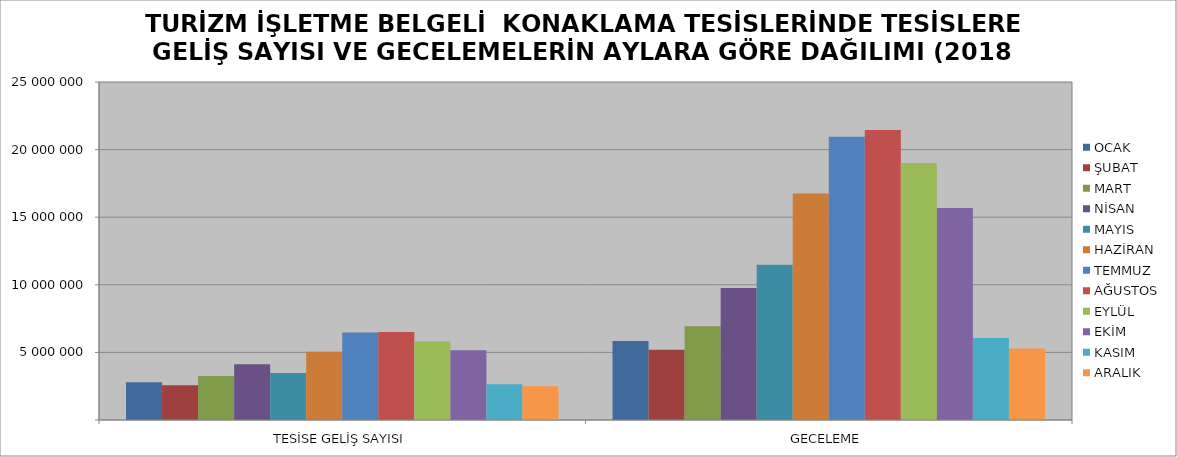
| Category | OCAK | ŞUBAT | MART | NİSAN | MAYIS | HAZİRAN | TEMMUZ | AĞUSTOS | EYLÜL | EKİM | KASIM | ARALIK |
|---|---|---|---|---|---|---|---|---|---|---|---|---|
| TESİSE GELİŞ SAYISI | 2792196 | 2573999 | 3258929 | 4119434 | 3468117 | 5043280 | 6471045 | 6513976 | 5800131 | 5161194 | 2643256 | 2499261 |
| GECELEME | 5837753 | 5199578 | 6939659 | 9767435 | 11484758 | 16745602 | 20944829 | 21446796 | 19007595 | 15688416 | 6060223 | 5292623 |